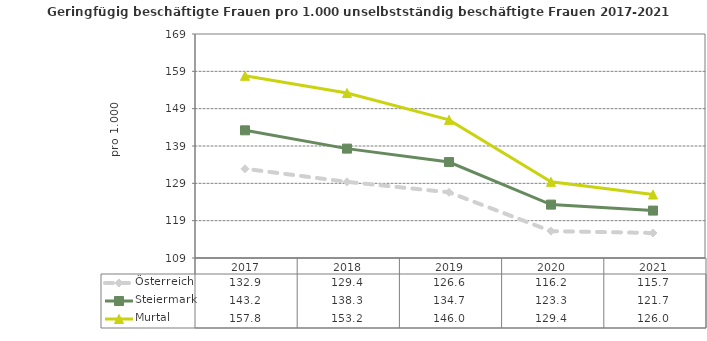
| Category | Österreich | Steiermark | Murtal |
|---|---|---|---|
| 2021.0 | 115.7 | 121.7 | 126 |
| 2020.0 | 116.2 | 123.3 | 129.4 |
| 2019.0 | 126.6 | 134.7 | 146 |
| 2018.0 | 129.4 | 138.3 | 153.2 |
| 2017.0 | 132.9 | 143.2 | 157.8 |